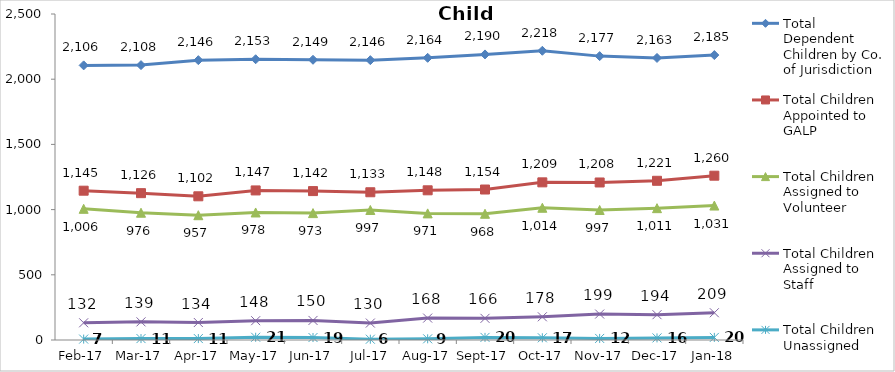
| Category | Total Dependent Children by Co. of Jurisdiction | Total Children Appointed to GALP | Total Children Assigned to Volunteer | Total Children Assigned to Staff | Total Children Unassigned |
|---|---|---|---|---|---|
| 2017-02-01 | 2106 | 1145 | 1006 | 132 | 7 |
| 2017-03-01 | 2108 | 1126 | 976 | 139 | 11 |
| 2017-04-01 | 2146 | 1102 | 957 | 134 | 11 |
| 2017-05-01 | 2153 | 1147 | 978 | 148 | 21 |
| 2017-06-01 | 2149 | 1142 | 973 | 150 | 19 |
| 2017-07-01 | 2146 | 1133 | 997 | 130 | 6 |
| 2017-08-01 | 2164 | 1148 | 971 | 168 | 9 |
| 2017-09-01 | 2190 | 1154 | 968 | 166 | 20 |
| 2017-10-01 | 2218 | 1209 | 1014 | 178 | 17 |
| 2017-11-01 | 2177 | 1208 | 997 | 199 | 12 |
| 2017-12-01 | 2163 | 1221 | 1011 | 194 | 16 |
| 2018-01-01 | 2185 | 1260 | 1031 | 209 | 20 |